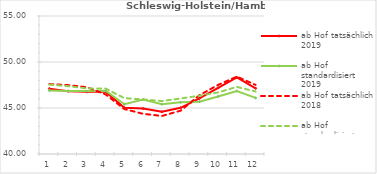
| Category | ab Hof tatsächlich 2019 | ab Hof standardisiert 2019 | ab Hof tatsächlich 2018 | ab Hof standardisiert 2018 |
|---|---|---|---|---|
| 0 | 47.105 | 46.899 | 47.6 | 47.548 |
| 1 | 46.832 | 46.847 | 47.488 | 47.372 |
| 2 | 46.754 | 46.835 | 47.261 | 47.127 |
| 3 | 46.779 | 46.874 | 46.478 | 47.109 |
| 4 | 45.028 | 45.411 | 44.885 | 46.072 |
| 5 | 44.935 | 45.919 | 44.37 | 45.931 |
| 6 | 44.585 | 45.419 | 44.135 | 45.754 |
| 7 | 45.021 | 45.614 | 44.709 | 46.037 |
| 8 | 46.04 | 45.686 | 46.387 | 46.328 |
| 9 | 47.188 | 46.248 | 47.513 | 46.696 |
| 10 | 48.318 | 46.846 | 48.414 | 47.296 |
| 11 | 47.138 | 46.096 | 47.509 | 46.791 |